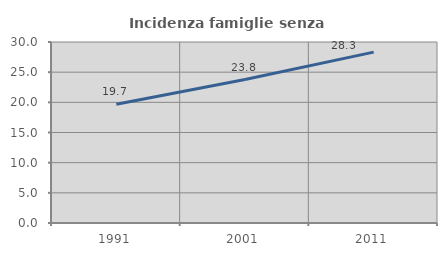
| Category | Incidenza famiglie senza nuclei |
|---|---|
| 1991.0 | 19.689 |
| 2001.0 | 23.779 |
| 2011.0 | 28.323 |